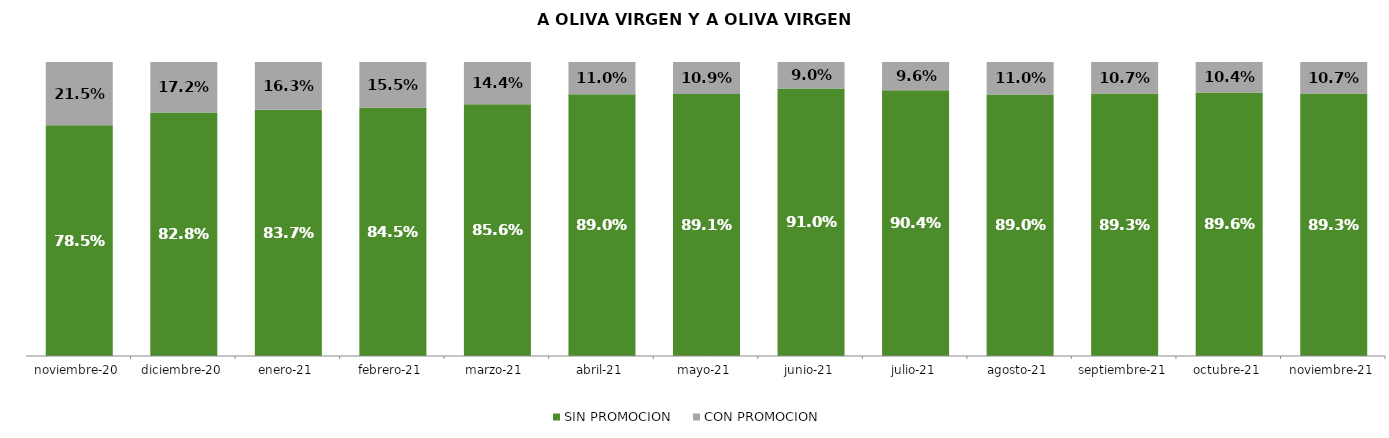
| Category | SIN PROMOCION   | CON PROMOCION   |
|---|---|---|
| 2020-11-01 | 0.785 | 0.215 |
| 2020-12-01 | 0.828 | 0.172 |
| 2021-01-01 | 0.837 | 0.163 |
| 2021-02-01 | 0.845 | 0.155 |
| 2021-03-01 | 0.856 | 0.144 |
| 2021-04-01 | 0.89 | 0.11 |
| 2021-05-01 | 0.891 | 0.109 |
| 2021-06-01 | 0.91 | 0.09 |
| 2021-07-01 | 0.904 | 0.096 |
| 2021-08-01 | 0.89 | 0.11 |
| 2021-09-01 | 0.893 | 0.107 |
| 2021-10-01 | 0.896 | 0.104 |
| 2021-11-01 | 0.893 | 0.107 |